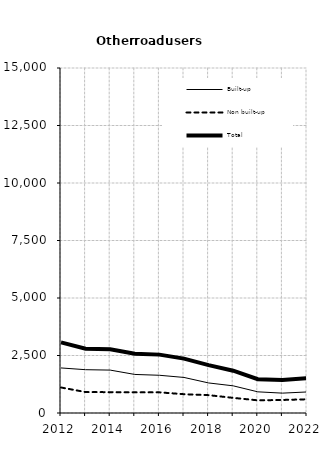
| Category | Built-up | Non built-up | Total |
|---|---|---|---|
| 2012.0 | 1959 | 1109 | 3068 |
| 2013.0 | 1883 | 911 | 2794 |
| 2014.0 | 1865 | 906 | 2771 |
| 2015.0 | 1676 | 898 | 2574 |
| 2016.0 | 1640 | 898 | 2538 |
| 2017.0 | 1546 | 817 | 2363 |
| 2018.0 | 1307 | 776 | 2083 |
| 2019.0 | 1181 | 658 | 1839 |
| 2020.0 | 920 | 551 | 1471 |
| 2021.0 | 864 | 567 | 1431 |
| 2022.0 | 915 | 596 | 1511 |